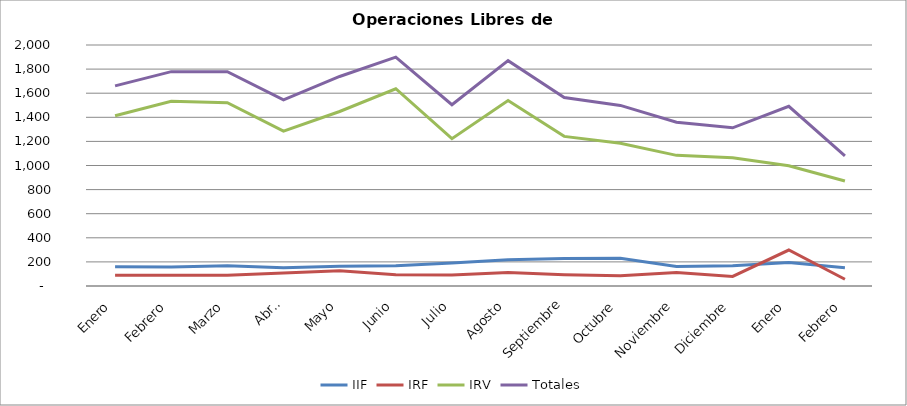
| Category | IIF | IRF | IRV | Totales |
|---|---|---|---|---|
| Enero | 159.143 | 88.524 | 1413.381 | 1661.048 |
| Febrero | 156.9 | 89.75 | 1532.35 | 1779 |
| Marzo | 168.261 | 88.652 | 1521.478 | 1778.391 |
| Abril | 151.125 | 107.75 | 1285.3 | 1544.175 |
| Mayo | 163 | 127.318 | 1448.364 | 1738.682 |
| Junio | 168.833 | 93.238 | 1637.048 | 1899.119 |
| Julio | 191.024 | 90.333 | 1223 | 1504.357 |
| Agosto | 218.773 | 111.682 | 1539.591 | 1870.045 |
| Septiembre | 227.833 | 94.31 | 1241.762 | 1563.905 |
| Octubre | 229.395 | 84.947 | 1184.158 | 1498.5 |
| Noviembre | 162.048 | 112.881 | 1084.286 | 1359.214 |
| Diciembre | 168.405 | 79.857 | 1064.333 | 1312.595 |
| Enero | 194.977 | 298.5 | 998.182 | 1491.659 |
| Febrero | 152.071 | 55.952 | 871.905 | 1079.929 |